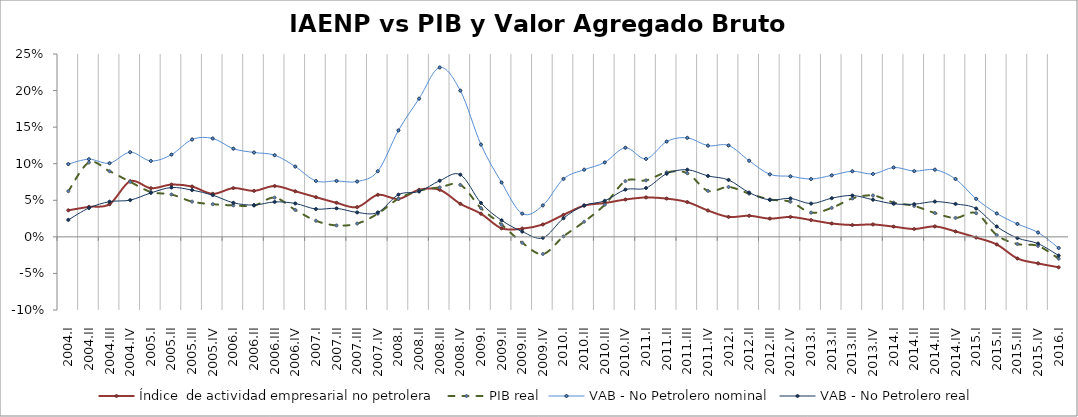
| Category | Índice  de actividad empresarial no petrolera | PIB real | VAB - No Petrolero nominal | VAB - No Petrolero real |
|---|---|---|---|---|
| 2004.I | 0.036 | 0.062 | 0.099 | 0.023 |
| 2004.II | 0.041 | 0.102 | 0.106 | 0.039 |
| 2004.III | 0.045 | 0.09 | 0.101 | 0.048 |
| 2004.IV | 0.076 | 0.075 | 0.116 | 0.05 |
| 2005.I | 0.066 | 0.061 | 0.104 | 0.06 |
| 2005.II | 0.071 | 0.058 | 0.112 | 0.067 |
| 2005.III | 0.069 | 0.048 | 0.133 | 0.064 |
| 2005.IV | 0.059 | 0.045 | 0.134 | 0.057 |
| 2006.I | 0.067 | 0.043 | 0.121 | 0.047 |
| 2006.II | 0.063 | 0.043 | 0.115 | 0.044 |
| 2006.III | 0.07 | 0.054 | 0.112 | 0.048 |
| 2006.IV | 0.062 | 0.037 | 0.096 | 0.046 |
| 2007.I | 0.054 | 0.022 | 0.076 | 0.038 |
| 2007.II | 0.047 | 0.016 | 0.076 | 0.039 |
| 2007.III | 0.041 | 0.018 | 0.076 | 0.033 |
| 2007.IV | 0.057 | 0.032 | 0.09 | 0.033 |
| 2008.I | 0.052 | 0.052 | 0.146 | 0.058 |
| 2008.II | 0.064 | 0.063 | 0.189 | 0.062 |
| 2008.III | 0.064 | 0.068 | 0.232 | 0.077 |
| 2008.IV | 0.045 | 0.071 | 0.2 | 0.085 |
| 2009.I | 0.032 | 0.039 | 0.126 | 0.046 |
| 2009.II | 0.012 | 0.017 | 0.074 | 0.023 |
| 2009.III | 0.011 | -0.008 | 0.032 | 0.007 |
| 2009.IV | 0.017 | -0.023 | 0.043 | -0.001 |
| 2010.I | 0.03 | 0.001 | 0.079 | 0.025 |
| 2010.II | 0.043 | 0.021 | 0.092 | 0.043 |
| 2010.III | 0.046 | 0.044 | 0.102 | 0.049 |
| 2010.IV | 0.051 | 0.076 | 0.122 | 0.065 |
| 2011.I | 0.054 | 0.077 | 0.107 | 0.067 |
| 2011.II | 0.052 | 0.088 | 0.13 | 0.086 |
| 2011.III | 0.048 | 0.087 | 0.135 | 0.092 |
| 2011.IV | 0.036 | 0.063 | 0.125 | 0.083 |
| 2012.I | 0.027 | 0.068 | 0.125 | 0.078 |
| 2012.II | 0.029 | 0.059 | 0.104 | 0.06 |
| 2012.III | 0.025 | 0.051 | 0.085 | 0.05 |
| 2012.IV | 0.027 | 0.048 | 0.083 | 0.053 |
| 2013.I | 0.023 | 0.033 | 0.079 | 0.046 |
| 2013.II | 0.018 | 0.04 | 0.084 | 0.053 |
| 2013.III | 0.016 | 0.052 | 0.09 | 0.057 |
| 2013.IV | 0.017 | 0.057 | 0.086 | 0.051 |
| 2014.I | 0.014 | 0.047 | 0.095 | 0.045 |
| 2014.II | 0.011 | 0.042 | 0.09 | 0.045 |
| 2014.III | 0.014 | 0.033 | 0.092 | 0.048 |
| 2014.IV | 0.007 | 0.026 | 0.079 | 0.045 |
| 2015.I | -0.001 | 0.032 | 0.052 | 0.039 |
| 2015.II | -0.01 | 0.002 | 0.032 | 0.014 |
| 2015.III | -0.03 | -0.01 | 0.018 | -0.002 |
| 2015.IV | -0.036 | -0.012 | 0.006 | -0.009 |
| 2016.I | -0.042 | -0.03 | -0.015 | -0.026 |